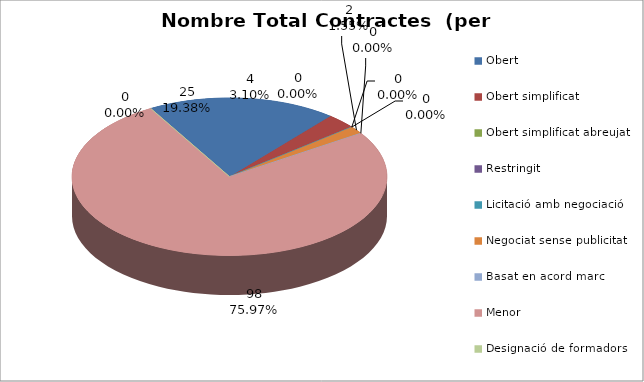
| Category | Nombre Total Contractes |
|---|---|
| Obert | 25 |
| Obert simplificat | 4 |
| Obert simplificat abreujat | 0 |
| Restringit | 0 |
| Licitació amb negociació | 0 |
| Negociat sense publicitat | 2 |
| Basat en acord marc | 0 |
| Menor | 98 |
| Designació de formadors | 0 |